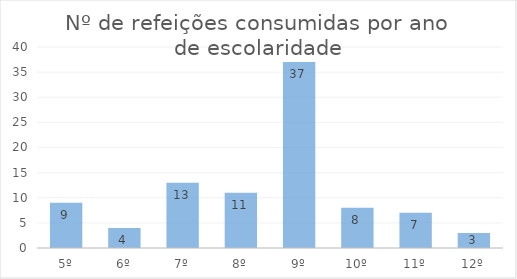
| Category |   |
|---|---|
| 5º | 9 |
| 6º | 4 |
| 7º | 13 |
| 8º | 11 |
| 9º | 37 |
| 10º | 8 |
| 11º | 7 |
| 12º | 3 |